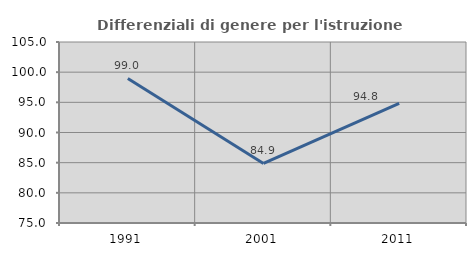
| Category | Differenziali di genere per l'istruzione superiore |
|---|---|
| 1991.0 | 98.957 |
| 2001.0 | 84.874 |
| 2011.0 | 94.838 |